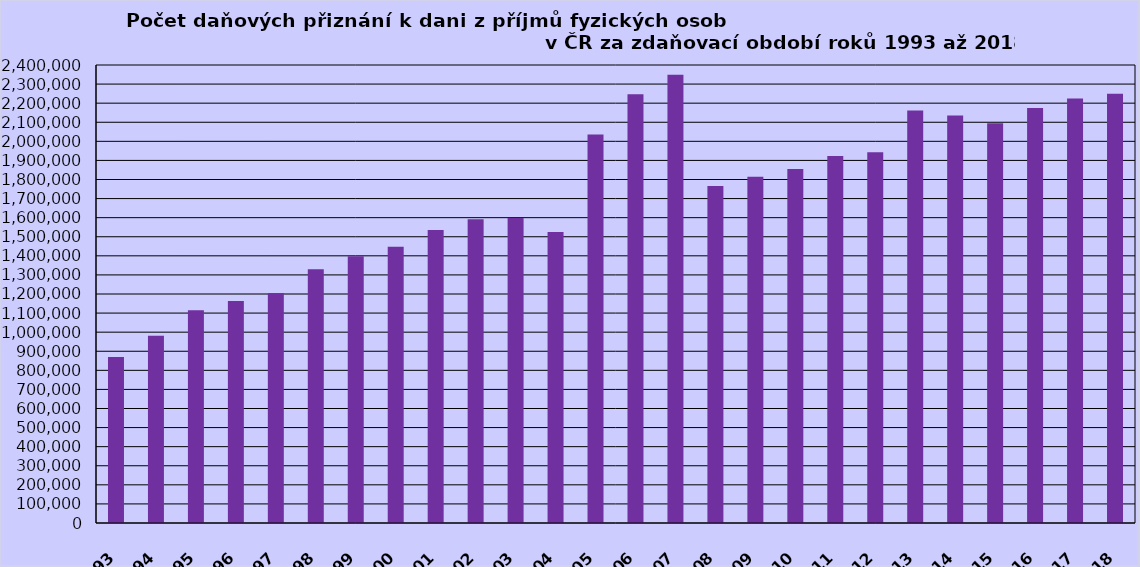
| Category | Series 0 |
|---|---|
| 1993 | 870485 |
| 1994 | 981759 |
| 1995 | 1115081 |
| 1996 | 1163781 |
| 1997 | 1205802 |
| 1998 | 1330034 |
| 1999 | 1398394 |
| 2000 | 1448084 |
| 2001 | 1535281 |
| 2002 | 1592244 |
| 2003 | 1598164 |
| 2004 | 1524649 |
| *2005 | 2036101 |
| 2006 | 2246839 |
| 2007 | 2348299 |
| 2008 | 1766154 |
| 2009 | 1813956 |
| 2010 | 1854794 |
| 2011 | 1922976 |
| 2012 | 1942762 |
| 2013 | 2161626 |
| 2014 | 2135170 |
| 2015 | 2094843 |
| 2016 | 2175088 |
| 2017 | 2225041 |
| 2018 | 2249773 |